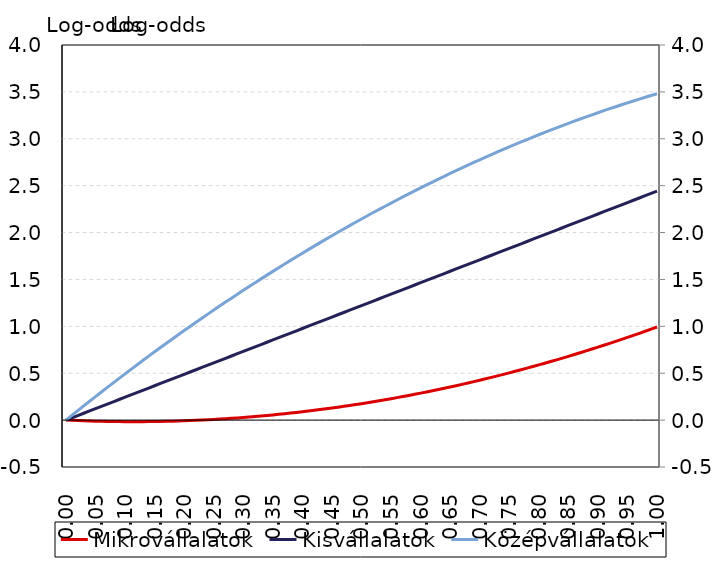
| Category | Mikrovállalatok | Kisvállalatok |
|---|---|---|
| 0.0 | 0 | 0 |
| 0.01 | -0.003 | 0.024 |
| 0.02 | -0.005 | 0.049 |
| 0.03 | -0.008 | 0.073 |
| 0.04 | -0.01 | 0.098 |
| 0.05 | -0.011 | 0.122 |
| 0.06 | -0.013 | 0.147 |
| 0.07 | -0.014 | 0.171 |
| 0.08 | -0.015 | 0.195 |
| 0.09 | -0.016 | 0.22 |
| 0.1 | -0.016 | 0.244 |
| 0.11 | -0.016 | 0.269 |
| 0.12 | -0.016 | 0.293 |
| 0.13 | -0.016 | 0.317 |
| 0.14 | -0.016 | 0.342 |
| 0.15 | -0.015 | 0.366 |
| 0.16 | -0.014 | 0.391 |
| 0.17 | -0.012 | 0.415 |
| 0.18 | -0.011 | 0.44 |
| 0.19 | -0.009 | 0.464 |
| 0.2 | -0.007 | 0.488 |
| 0.21 | -0.005 | 0.513 |
| 0.22 | -0.002 | 0.537 |
| 0.23 | 0.001 | 0.562 |
| 0.24 | 0.004 | 0.586 |
| 0.25 | 0.007 | 0.61 |
| 0.26 | 0.011 | 0.635 |
| 0.27 | 0.015 | 0.659 |
| 0.28 | 0.019 | 0.684 |
| 0.29 | 0.024 | 0.708 |
| 0.3 | 0.028 | 0.733 |
| 0.31 | 0.033 | 0.757 |
| 0.32 | 0.038 | 0.781 |
| 0.33 | 0.044 | 0.806 |
| 0.34 | 0.049 | 0.83 |
| 0.35 | 0.055 | 0.855 |
| 0.36 | 0.062 | 0.879 |
| 0.37 | 0.068 | 0.904 |
| 0.38 | 0.075 | 0.928 |
| 0.39 | 0.082 | 0.952 |
| 0.4 | 0.089 | 0.977 |
| 0.41 | 0.096 | 1.001 |
| 0.42 | 0.104 | 1.026 |
| 0.43 | 0.112 | 1.05 |
| 0.44 | 0.12 | 1.074 |
| 0.45 | 0.129 | 1.099 |
| 0.46 | 0.138 | 1.123 |
| 0.47 | 0.147 | 1.148 |
| 0.48 | 0.156 | 1.172 |
| 0.49 | 0.166 | 1.197 |
| 0.5 | 0.175 | 1.221 |
| 0.51 | 0.185 | 1.245 |
| 0.52 | 0.196 | 1.27 |
| 0.53 | 0.206 | 1.294 |
| 0.54 | 0.217 | 1.319 |
| 0.55 | 0.228 | 1.343 |
| 0.56 | 0.24 | 1.368 |
| 0.57 | 0.251 | 1.392 |
| 0.58 | 0.263 | 1.416 |
| 0.59 | 0.275 | 1.441 |
| 0.6 | 0.288 | 1.465 |
| 0.61 | 0.3 | 1.49 |
| 0.62 | 0.313 | 1.514 |
| 0.63 | 0.326 | 1.538 |
| 0.64 | 0.34 | 1.563 |
| 0.65 | 0.353 | 1.587 |
| 0.66 | 0.367 | 1.612 |
| 0.67 | 0.381 | 1.636 |
| 0.68 | 0.396 | 1.661 |
| 0.69 | 0.41 | 1.685 |
| 0.7 | 0.425 | 1.709 |
| 0.71 | 0.441 | 1.734 |
| 0.72 | 0.456 | 1.758 |
| 0.73 | 0.472 | 1.783 |
| 0.74 | 0.488 | 1.807 |
| 0.75 | 0.504 | 1.831 |
| 0.76 | 0.52 | 1.856 |
| 0.77 | 0.537 | 1.88 |
| 0.78 | 0.554 | 1.905 |
| 0.79 | 0.571 | 1.929 |
| 0.8 | 0.589 | 1.954 |
| 0.81 | 0.607 | 1.978 |
| 0.82 | 0.625 | 2.002 |
| 0.83 | 0.643 | 2.027 |
| 0.84 | 0.661 | 2.051 |
| 0.85 | 0.68 | 2.076 |
| 0.86 | 0.699 | 2.1 |
| 0.87 | 0.719 | 2.125 |
| 0.88 | 0.738 | 2.149 |
| 0.89 | 0.758 | 2.173 |
| 0.9 | 0.778 | 2.198 |
| 0.91 | 0.798 | 2.222 |
| 0.92 | 0.819 | 2.247 |
| 0.93 | 0.84 | 2.271 |
| 0.94 | 0.861 | 2.295 |
| 0.95 | 0.882 | 2.32 |
| 0.96 | 0.904 | 2.344 |
| 0.97 | 0.926 | 2.369 |
| 0.98 | 0.948 | 2.393 |
| 0.99 | 0.97 | 2.418 |
| 1.0 | 0.993 | 2.442 |